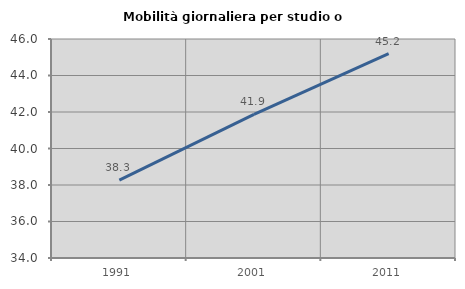
| Category | Mobilità giornaliera per studio o lavoro |
|---|---|
| 1991.0 | 38.267 |
| 2001.0 | 41.871 |
| 2011.0 | 45.203 |